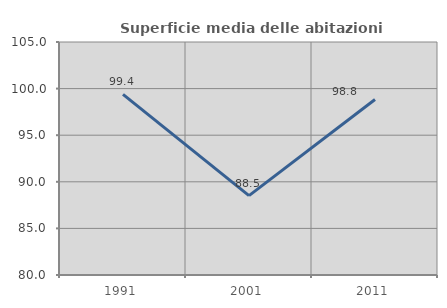
| Category | Superficie media delle abitazioni occupate |
|---|---|
| 1991.0 | 99.374 |
| 2001.0 | 88.521 |
| 2011.0 | 98.832 |